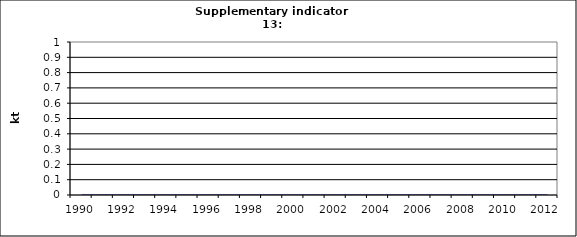
| Category | Physical output of paper, kt |
|---|---|
| 1990 | 0 |
| 1991 | 0 |
| 1992 | 0 |
| 1993 | 0 |
| 1994 | 0 |
| 1995 | 0 |
| 1996 | 0 |
| 1997 | 0 |
| 1998 | 0 |
| 1999 | 0 |
| 2000 | 0 |
| 2001 | 0 |
| 2002 | 0 |
| 2003 | 0 |
| 2004 | 0 |
| 2005 | 0 |
| 2006 | 0 |
| 2007 | 0 |
| 2008 | 0 |
| 2009 | 0 |
| 2010 | 0 |
| 2011 | 0 |
| 2012 | 0 |